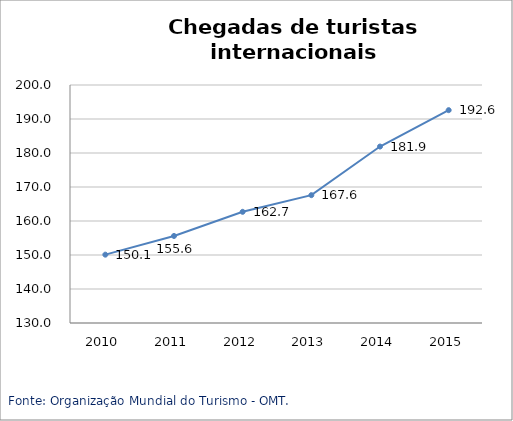
| Category | Américas |
|---|---|
| 2010.0 | 150.1 |
| 2011.0 | 155.6 |
| 2012.0 | 162.7 |
| 2013.0 | 167.6 |
| 2014.0 | 181.9 |
| 2015.0 | 192.6 |